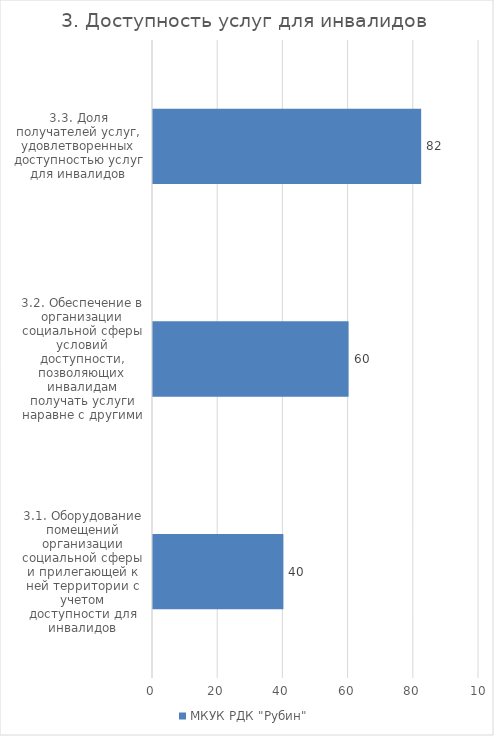
| Category | МКУК РДК "Рубин"  |
|---|---|
| 3.1. Оборудование помещений организации социальной сферы и прилегающей к ней территории с учетом доступности для инвалидов | 40 |
| 3.2. Обеспечение в организации социальной сферы условий доступности, позволяющих инвалидам получать услуги наравне с другими | 60 |
| 3.3. Доля получателей услуг, удовлетворенных доступностью услуг для инвалидов | 82.258 |